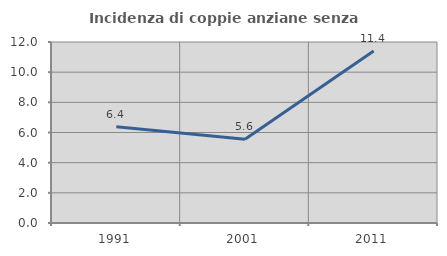
| Category | Incidenza di coppie anziane senza figli  |
|---|---|
| 1991.0 | 6.383 |
| 2001.0 | 5.556 |
| 2011.0 | 11.404 |